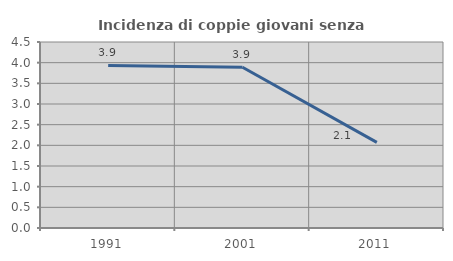
| Category | Incidenza di coppie giovani senza figli |
|---|---|
| 1991.0 | 3.933 |
| 2001.0 | 3.89 |
| 2011.0 | 2.072 |